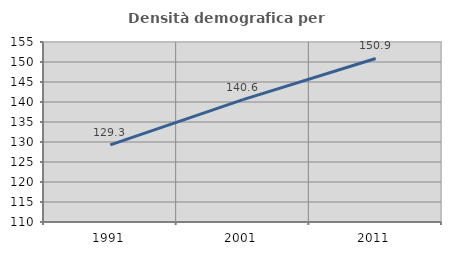
| Category | Densità demografica |
|---|---|
| 1991.0 | 129.263 |
| 2001.0 | 140.602 |
| 2011.0 | 150.876 |